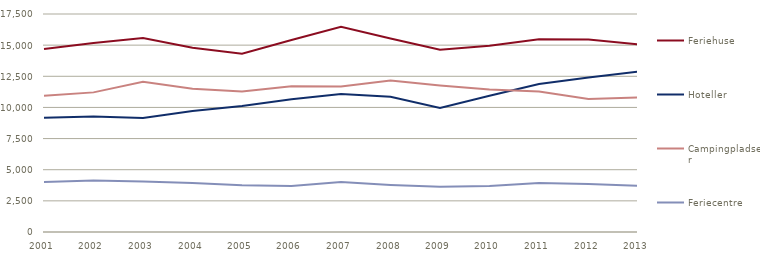
| Category | Feriehuse | Hoteller | Campingpladser | Feriecentre |
|---|---|---|---|---|
| 2001 | 14699 | 9172.855 | 10942.082 | 4007.253 |
| 2002 | 15178 | 9261.921 | 11208.263 | 4142.491 |
| 2003 | 15568 | 9160.789 | 12054.774 | 4059.14 |
| 2004 | 14788.573 | 9711.321 | 11504.774 | 3928.709 |
| 2005 | 14312.742 | 10119.236 | 11287.095 | 3760.425 |
| 2006 | 15407.726 | 10647.099 | 11697.984 | 3686.415 |
| 2007 | 16465.221 | 11076.438 | 11683.947 | 4006.916 |
| 2008 | 15538.264 | 10856.645 | 12168.909 | 3778.17 |
| 2009 | 14625.463 | 9965.57 | 11769.117 | 3635.516 |
| 2010 | 14948.68 | 10938.665 | 11448.417 | 3688.254 |
| 2011 | 15471.709 | 11885.455 | 11276.332 | 3934.975 |
| 2012 | 15458.454 | 12400.183 | 10677.525 | 3844.594 |
| 2013 | 15060.562 | 12881.674 | 10803.4 | 3700.294 |